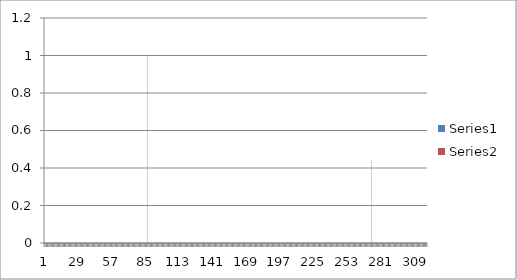
| Category | Series 0 | Series 1 |
|---|---|---|
| 0 | 0 | 0 |
| 1 | 0 | 0 |
| 2 | 0 | 0 |
| 3 | 0 | 0 |
| 4 | 0 | 0 |
| 5 | 0 | 0 |
| 6 | 0 | 0 |
| 7 | 0 | 0 |
| 8 | 0 | 0 |
| 9 | 0 | 0 |
| 10 | 0 | 0 |
| 11 | 0 | 0 |
| 12 | 0 | 0 |
| 13 | 0 | 0 |
| 14 | 0 | 0 |
| 15 | 0 | 0 |
| 16 | 0 | 0 |
| 17 | 0 | 0 |
| 18 | 0 | 0 |
| 19 | 0 | 0 |
| 20 | 0 | 0 |
| 21 | 0 | 0 |
| 22 | 0 | 0 |
| 23 | 0 | 0 |
| 24 | 0 | 0 |
| 25 | 0 | 0 |
| 26 | 0 | 0 |
| 27 | 0 | 0 |
| 28 | 0 | 0 |
| 29 | 0 | 0 |
| 30 | 0 | 0 |
| 31 | 0 | 0 |
| 32 | 0 | 0 |
| 33 | 0 | 0 |
| 34 | 0 | 0 |
| 35 | 0 | 0 |
| 36 | 0 | 0 |
| 37 | 0 | 0 |
| 38 | 0 | 0 |
| 39 | 0 | 0 |
| 40 | 0 | 0 |
| 41 | 0 | 0 |
| 42 | 0 | 0 |
| 43 | 0 | 0 |
| 44 | 0 | 0 |
| 45 | 0 | 0 |
| 46 | 0 | 0 |
| 47 | 0 | 0 |
| 48 | 0 | 0 |
| 49 | 0 | 0 |
| 50 | 0 | 0 |
| 51 | 0 | 0 |
| 52 | 0 | 0 |
| 53 | 0 | 0 |
| 54 | 0 | 0 |
| 55 | 0 | 0 |
| 56 | 0 | 0 |
| 57 | 0 | 0 |
| 58 | 0 | 0 |
| 59 | 0 | 0 |
| 60 | 0 | 0 |
| 61 | 0 | 0 |
| 62 | 0 | 0 |
| 63 | 0 | 0 |
| 64 | 0 | 0 |
| 65 | 0 | 0 |
| 66 | 0 | 0 |
| 67 | 0 | 0 |
| 68 | 0 | 0 |
| 69 | 0 | 0 |
| 70 | 0 | 0 |
| 71 | 0 | 0 |
| 72 | 0 | 0 |
| 73 | 0 | 0 |
| 74 | 0 | 0 |
| 75 | 0 | 0 |
| 76 | 0 | 0 |
| 77 | 0 | 0 |
| 78 | 0 | 0 |
| 79 | 0 | 0 |
| 80 | 0 | 0 |
| 81 | 0 | 0 |
| 82 | 0 | 0 |
| 83 | 0 | 0 |
| 84 | 0 | 0 |
| 85 | 1 | 0 |
| 86 | 0 | 0 |
| 87 | 0 | 0 |
| 88 | 0 | 0 |
| 89 | 0 | 0 |
| 90 | 0 | 0 |
| 91 | 0 | 0 |
| 92 | 0 | 0 |
| 93 | 0 | 0 |
| 94 | 0 | 0 |
| 95 | 0 | 0 |
| 96 | 0 | 0 |
| 97 | 0 | 0 |
| 98 | 0 | 0 |
| 99 | 0 | 0 |
| 100 | 0 | 0 |
| 101 | 0 | 0 |
| 102 | 0 | 0 |
| 103 | 0 | 0 |
| 104 | 0 | 0 |
| 105 | 0 | 0 |
| 106 | 0 | 0 |
| 107 | 0 | 0 |
| 108 | 0 | 0 |
| 109 | 0 | 0 |
| 110 | 0 | 0 |
| 111 | 0 | 0 |
| 112 | 0 | 0 |
| 113 | 0 | 0 |
| 114 | 0 | 0 |
| 115 | 0 | 0 |
| 116 | 0 | 0 |
| 117 | 0 | 0 |
| 118 | 0 | 0 |
| 119 | 0 | 0 |
| 120 | 0 | 0 |
| 121 | 0 | 0 |
| 122 | 0 | 0 |
| 123 | 0 | 0 |
| 124 | 0 | 0 |
| 125 | 0 | 0 |
| 126 | 0 | 0 |
| 127 | 0 | 0 |
| 128 | 0 | 0 |
| 129 | 0 | 0 |
| 130 | 0 | 0 |
| 131 | 0 | 0 |
| 132 | 0 | 0 |
| 133 | 0 | 0 |
| 134 | 0 | 0 |
| 135 | 0 | 0 |
| 136 | 0 | 0 |
| 137 | 0 | 0 |
| 138 | 0 | 0 |
| 139 | 0 | 0 |
| 140 | 0 | 0 |
| 141 | 0 | 0 |
| 142 | 0 | 0 |
| 143 | 0 | 0 |
| 144 | 0 | 0 |
| 145 | 0 | 0 |
| 146 | 0 | 0 |
| 147 | 0 | 0 |
| 148 | 0 | 0 |
| 149 | 0 | 0 |
| 150 | 0 | 0 |
| 151 | 0 | 0 |
| 152 | 0 | 0 |
| 153 | 0 | 0 |
| 154 | 0 | 0 |
| 155 | 0 | 0 |
| 156 | 0 | 0 |
| 157 | 0 | 0 |
| 158 | 0 | 0 |
| 159 | 0 | 0 |
| 160 | 0 | 0 |
| 161 | 0 | 0 |
| 162 | 0 | 0 |
| 163 | 0 | 0 |
| 164 | 0 | 0 |
| 165 | 0 | 0 |
| 166 | 0 | 0 |
| 167 | 0 | 0 |
| 168 | 0 | 0 |
| 169 | 0 | 0 |
| 170 | 0 | 0 |
| 171 | 0 | 0 |
| 172 | 0 | 0 |
| 173 | 0 | 0 |
| 174 | 0 | 0 |
| 175 | 0 | 0 |
| 176 | 0 | 0 |
| 177 | 0 | 0 |
| 178 | 0 | 0 |
| 179 | 0 | 0 |
| 180 | 0 | 0 |
| 181 | 0 | 0 |
| 182 | 0 | 0 |
| 183 | 0 | 0 |
| 184 | 0 | 0 |
| 185 | 0 | 0 |
| 186 | 0 | 0 |
| 187 | 0 | 0 |
| 188 | 0 | 0 |
| 189 | 0 | 0 |
| 190 | 0 | 0 |
| 191 | 0 | 0 |
| 192 | 0 | 0 |
| 193 | 0 | 0 |
| 194 | 0 | 0 |
| 195 | 0 | 0 |
| 196 | 0 | 0 |
| 197 | 0 | 0 |
| 198 | 0 | 0 |
| 199 | 0 | 0 |
| 200 | 0 | 0 |
| 201 | 0 | 0 |
| 202 | 0 | 0 |
| 203 | 0 | 0 |
| 204 | 0 | 0 |
| 205 | 0 | 0 |
| 206 | 0 | 0 |
| 207 | 0 | 0 |
| 208 | 0 | 0 |
| 209 | 0 | 0 |
| 210 | 0 | 0 |
| 211 | 0 | 0 |
| 212 | 0 | 0 |
| 213 | 0 | 0 |
| 214 | 0 | 0 |
| 215 | 0 | 0 |
| 216 | 0 | 0 |
| 217 | 0 | 0 |
| 218 | 0 | 0 |
| 219 | 0 | 0 |
| 220 | 0 | 0 |
| 221 | 0 | 0 |
| 222 | 0 | 0 |
| 223 | 0 | 0 |
| 224 | 0 | 0 |
| 225 | 0 | 0 |
| 226 | 0 | 0 |
| 227 | 0 | 0 |
| 228 | 0 | 0 |
| 229 | 0 | 0 |
| 230 | 0 | 0 |
| 231 | 0 | 0 |
| 232 | 0 | 0 |
| 233 | 0 | 0 |
| 234 | 0 | 0 |
| 235 | 0 | 0 |
| 236 | 0 | 0 |
| 237 | 0 | 0 |
| 238 | 0 | 0 |
| 239 | 0 | 0 |
| 240 | 0 | 0 |
| 241 | 0 | 0 |
| 242 | 0 | 0 |
| 243 | 0 | 0 |
| 244 | 0 | 0 |
| 245 | 0 | 0 |
| 246 | 0 | 0 |
| 247 | 0 | 0 |
| 248 | 0 | 0 |
| 249 | 0 | 0 |
| 250 | 0 | 0 |
| 251 | 0 | 0 |
| 252 | 0 | 0 |
| 253 | 0 | 0 |
| 254 | 0 | 0 |
| 255 | 0 | 0 |
| 256 | 0 | 0 |
| 257 | 0 | 0 |
| 258 | 0 | 0 |
| 259 | 0 | 0 |
| 260 | 0 | 0 |
| 261 | 0 | 0 |
| 262 | 0 | 0 |
| 263 | 0 | 0 |
| 264 | 0 | 0 |
| 265 | 0 | 0 |
| 266 | 0 | 0 |
| 267 | 0 | 0 |
| 268 | 0 | 0 |
| 269 | 0 | 0 |
| 270 | 0 | 0 |
| 271 | 0.443 | 0 |
| 272 | 0 | 0 |
| 273 | 0 | 0 |
| 274 | 0 | 0 |
| 275 | 0 | 0 |
| 276 | 0 | 0 |
| 277 | 0 | 0 |
| 278 | 0 | 0 |
| 279 | 0 | 0 |
| 280 | 0 | 0 |
| 281 | 0 | 0 |
| 282 | 0 | 0 |
| 283 | 0 | 0 |
| 284 | 0 | 0 |
| 285 | 0 | 0 |
| 286 | 0 | 0 |
| 287 | 0 | 0 |
| 288 | 0 | 0 |
| 289 | 0 | 0 |
| 290 | 0 | 0 |
| 291 | 0 | 0 |
| 292 | 0 | 0 |
| 293 | 0 | 0 |
| 294 | 0 | 0 |
| 295 | 0 | 0 |
| 296 | 0 | 0 |
| 297 | 0 | 0 |
| 298 | 0 | 0 |
| 299 | 0 | 0 |
| 300 | 0 | 0 |
| 301 | 0 | 0 |
| 302 | 0 | 0 |
| 303 | 0 | 0 |
| 304 | 0 | 0 |
| 305 | 0 | 0 |
| 306 | 0 | 0 |
| 307 | 0 | 0 |
| 308 | 0 | 0 |
| 309 | 0 | 0 |
| 310 | 0 | 0 |
| 311 | 0 | 0 |
| 312 | 0 | 0 |
| 313 | 0 | 0 |
| 314 | 0 | 0 |
| 315 | 0 | 0 |
| 316 | 0 | 0 |